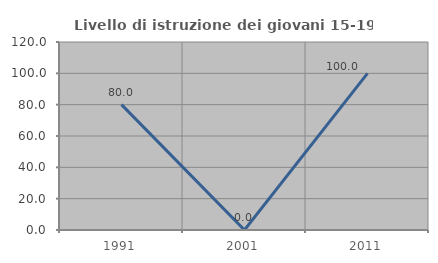
| Category | Livello di istruzione dei giovani 15-19 anni |
|---|---|
| 1991.0 | 80 |
| 2001.0 | 0 |
| 2011.0 | 100 |